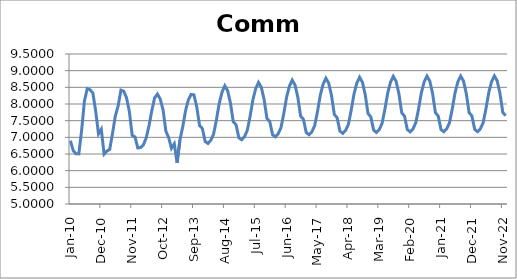
| Category | Series 0 |
|---|---|
| 2010-01-01 | 6.9 |
| 2010-02-01 | 6.602 |
| 2010-03-01 | 6.506 |
| 2010-04-01 | 6.504 |
| 2010-05-01 | 7.214 |
| 2010-06-01 | 8.093 |
| 2010-07-01 | 8.46 |
| 2010-08-01 | 8.429 |
| 2010-09-01 | 8.329 |
| 2010-10-01 | 7.791 |
| 2010-11-01 | 7.104 |
| 2010-12-01 | 7.244 |
| 2011-01-01 | 6.497 |
| 2011-02-01 | 6.589 |
| 2011-03-01 | 6.637 |
| 2011-04-01 | 7.118 |
| 2011-05-01 | 7.64 |
| 2011-06-01 | 7.944 |
| 2011-07-01 | 8.417 |
| 2011-08-01 | 8.383 |
| 2011-09-01 | 8.182 |
| 2011-10-01 | 7.774 |
| 2011-11-01 | 7.059 |
| 2011-12-01 | 7.013 |
| 2012-01-01 | 6.684 |
| 2012-02-01 | 6.692 |
| 2012-03-01 | 6.777 |
| 2012-04-01 | 6.984 |
| 2012-05-01 | 7.347 |
| 2012-06-01 | 7.805 |
| 2012-07-01 | 8.185 |
| 2012-08-01 | 8.298 |
| 2012-09-01 | 8.147 |
| 2012-10-01 | 7.823 |
| 2012-11-01 | 7.186 |
| 2012-12-01 | 6.991 |
| 2013-01-01 | 6.672 |
| 2013-02-01 | 6.806 |
| 2013-03-01 | 6.233 |
| 2013-04-01 | 6.917 |
| 2013-05-01 | 7.311 |
| 2013-06-01 | 7.797 |
| 2013-07-01 | 8.123 |
| 2013-08-01 | 8.286 |
| 2013-09-01 | 8.274 |
| 2013-10-01 | 7.915 |
| 2013-11-01 | 7.355 |
| 2013-12-01 | 7.264 |
| 2014-01-01 | 6.876 |
| 2014-02-01 | 6.816 |
| 2014-03-01 | 6.911 |
| 2014-04-01 | 7.099 |
| 2014-05-01 | 7.523 |
| 2014-06-01 | 8.017 |
| 2014-07-01 | 8.356 |
| 2014-08-01 | 8.547 |
| 2014-09-01 | 8.4 |
| 2014-10-01 | 8.03 |
| 2014-11-01 | 7.469 |
| 2014-12-01 | 7.378 |
| 2015-01-01 | 6.988 |
| 2015-02-01 | 6.927 |
| 2015-03-01 | 7.021 |
| 2015-04-01 | 7.208 |
| 2015-05-01 | 7.632 |
| 2015-06-01 | 8.126 |
| 2015-07-01 | 8.461 |
| 2015-08-01 | 8.647 |
| 2015-09-01 | 8.501 |
| 2015-10-01 | 8.13 |
| 2015-11-01 | 7.566 |
| 2015-12-01 | 7.472 |
| 2016-01-01 | 7.08 |
| 2016-02-01 | 7.016 |
| 2016-03-01 | 7.106 |
| 2016-04-01 | 7.291 |
| 2016-05-01 | 7.712 |
| 2016-06-01 | 8.203 |
| 2016-07-01 | 8.535 |
| 2016-08-01 | 8.717 |
| 2016-09-01 | 8.571 |
| 2016-10-01 | 8.201 |
| 2016-11-01 | 7.636 |
| 2016-12-01 | 7.539 |
| 2017-01-01 | 7.143 |
| 2017-02-01 | 7.078 |
| 2017-03-01 | 7.167 |
| 2017-04-01 | 7.352 |
| 2017-05-01 | 7.772 |
| 2017-06-01 | 8.263 |
| 2017-07-01 | 8.593 |
| 2017-08-01 | 8.773 |
| 2017-09-01 | 8.625 |
| 2017-10-01 | 8.254 |
| 2017-11-01 | 7.685 |
| 2017-12-01 | 7.586 |
| 2018-01-01 | 7.185 |
| 2018-02-01 | 7.118 |
| 2018-03-01 | 7.205 |
| 2018-04-01 | 7.388 |
| 2018-05-01 | 7.807 |
| 2018-06-01 | 8.297 |
| 2018-07-01 | 8.625 |
| 2018-08-01 | 8.803 |
| 2018-09-01 | 8.655 |
| 2018-10-01 | 8.281 |
| 2018-11-01 | 7.713 |
| 2018-12-01 | 7.614 |
| 2019-01-01 | 7.214 |
| 2019-02-01 | 7.147 |
| 2019-03-01 | 7.233 |
| 2019-04-01 | 7.416 |
| 2019-05-01 | 7.835 |
| 2019-06-01 | 8.324 |
| 2019-07-01 | 8.653 |
| 2019-08-01 | 8.829 |
| 2019-09-01 | 8.681 |
| 2019-10-01 | 8.307 |
| 2019-11-01 | 7.737 |
| 2019-12-01 | 7.635 |
| 2020-01-01 | 7.232 |
| 2020-02-01 | 7.164 |
| 2020-03-01 | 7.25 |
| 2020-04-01 | 7.435 |
| 2020-05-01 | 7.853 |
| 2020-06-01 | 8.339 |
| 2020-07-01 | 8.665 |
| 2020-08-01 | 8.838 |
| 2020-09-01 | 8.689 |
| 2020-10-01 | 8.312 |
| 2020-11-01 | 7.741 |
| 2020-12-01 | 7.639 |
| 2021-01-01 | 7.236 |
| 2021-02-01 | 7.167 |
| 2021-03-01 | 7.251 |
| 2021-04-01 | 7.433 |
| 2021-05-01 | 7.851 |
| 2021-06-01 | 8.338 |
| 2021-07-01 | 8.665 |
| 2021-08-01 | 8.838 |
| 2021-09-01 | 8.69 |
| 2021-10-01 | 8.314 |
| 2021-11-01 | 7.743 |
| 2021-12-01 | 7.642 |
| 2022-01-01 | 7.24 |
| 2022-02-01 | 7.17 |
| 2022-03-01 | 7.254 |
| 2022-04-01 | 7.436 |
| 2022-05-01 | 7.854 |
| 2022-06-01 | 8.342 |
| 2022-07-01 | 8.669 |
| 2022-08-01 | 8.843 |
| 2022-09-01 | 8.695 |
| 2022-10-01 | 8.32 |
| 2022-11-01 | 7.749 |
| 2022-12-01 | 7.648 |